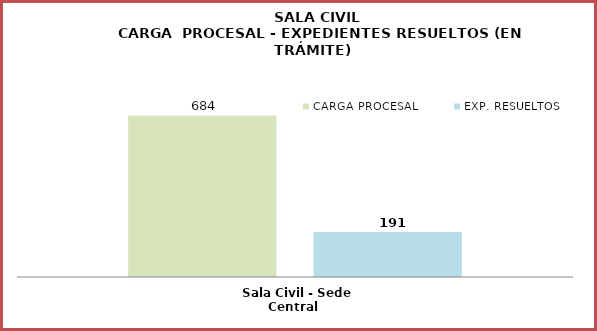
| Category | CARGA PROCESAL | EXP. RESUELTOS |
|---|---|---|
| Sala Civil - Sede Central | 684 | 191 |